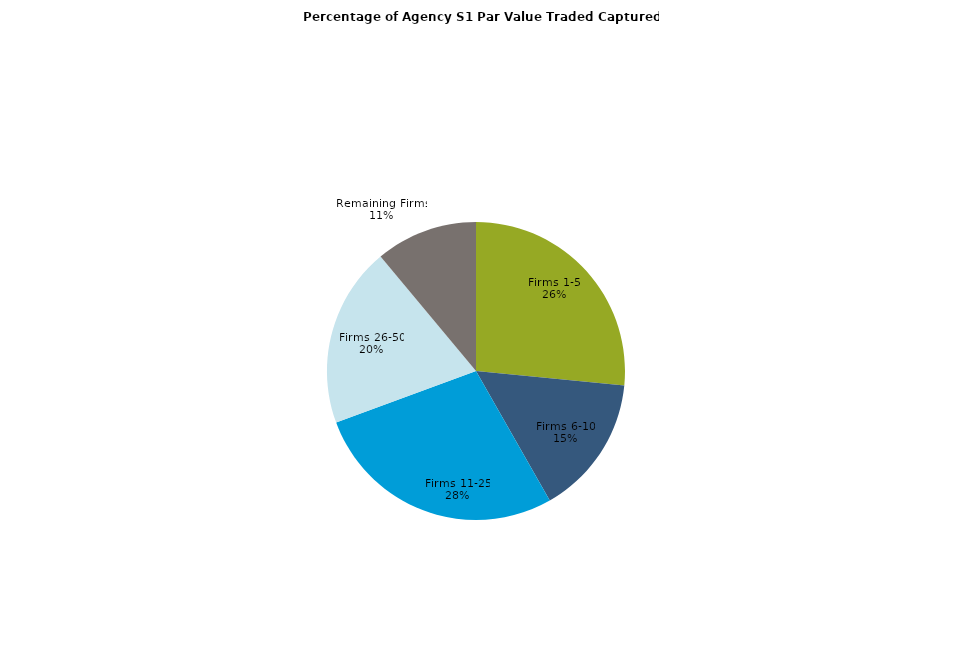
| Category | Series 0 |
|---|---|
| Firms 1-5 | 0.265 |
| Firms 6-10 | 0.152 |
| Firms 11-25 | 0.276 |
| Firms 26-50 | 0.195 |
| Remaining Firms | 0.111 |